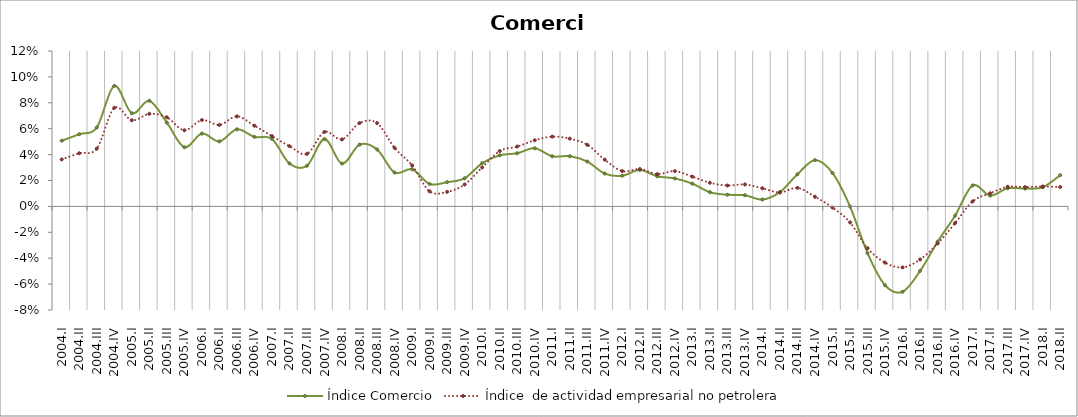
| Category | Índice Comercio | Índice  de actividad empresarial no petrolera |
|---|---|---|
| 2004.I | 0.051 | 0.036 |
| 2004.II | 0.056 | 0.041 |
| 2004.III | 0.061 | 0.045 |
| 2004.IV | 0.093 | 0.076 |
| 2005.I | 0.072 | 0.066 |
| 2005.II | 0.082 | 0.071 |
| 2005.III | 0.065 | 0.069 |
| 2005.IV | 0.046 | 0.059 |
| 2006.I | 0.056 | 0.067 |
| 2006.II | 0.05 | 0.063 |
| 2006.III | 0.06 | 0.07 |
| 2006.IV | 0.054 | 0.062 |
| 2007.I | 0.052 | 0.054 |
| 2007.II | 0.033 | 0.047 |
| 2007.III | 0.031 | 0.041 |
| 2007.IV | 0.052 | 0.057 |
| 2008.I | 0.033 | 0.052 |
| 2008.II | 0.048 | 0.064 |
| 2008.III | 0.044 | 0.064 |
| 2008.IV | 0.026 | 0.045 |
| 2009.I | 0.029 | 0.032 |
| 2009.II | 0.017 | 0.012 |
| 2009.III | 0.019 | 0.011 |
| 2009.IV | 0.022 | 0.017 |
| 2010.I | 0.033 | 0.03 |
| 2010.II | 0.039 | 0.043 |
| 2010.III | 0.041 | 0.046 |
| 2010.IV | 0.045 | 0.051 |
| 2011.I | 0.039 | 0.054 |
| 2011.II | 0.039 | 0.052 |
| 2011.III | 0.035 | 0.048 |
| 2011.IV | 0.025 | 0.036 |
| 2012.I | 0.024 | 0.027 |
| 2012.II | 0.028 | 0.029 |
| 2012.III | 0.023 | 0.025 |
| 2012.IV | 0.022 | 0.027 |
| 2013.I | 0.018 | 0.023 |
| 2013.II | 0.011 | 0.018 |
| 2013.III | 0.009 | 0.016 |
| 2013.IV | 0.009 | 0.017 |
| 2014.I | 0.005 | 0.014 |
| 2014.II | 0.011 | 0.011 |
| 2014.III | 0.025 | 0.014 |
| 2014.IV | 0.036 | 0.007 |
| 2015.I | 0.026 | -0.001 |
| 2015.II | 0 | -0.012 |
| 2015.III | -0.036 | -0.032 |
| 2015.IV | -0.061 | -0.043 |
| 2016.I | -0.066 | -0.047 |
| 2016.II | -0.05 | -0.041 |
| 2016.III | -0.027 | -0.029 |
| 2016.IV | -0.007 | -0.013 |
| 2017.I | 0.016 | 0.004 |
| 2017.II | 0.008 | 0.01 |
| 2017.III | 0.014 | 0.015 |
| 2017.IV | 0.014 | 0.015 |
| 2018.I | 0.015 | 0.015 |
| 2018.II | 0.024 | 0.015 |